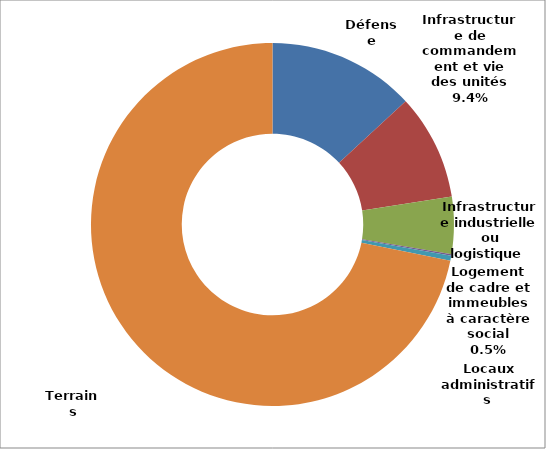
| Category | Series 0 |
|---|---|
| Défense | 34046.945 |
| Infrastructure de commandement et vie des unités | 24518.923 |
| Infrastructure industrielle ou logistique  | 13166.322 |
| Locaux administratifs  | 366.888 |
| Logement de cadre et immeubles à caractère social | 1178.851 |
| Terrains | 186511.329 |